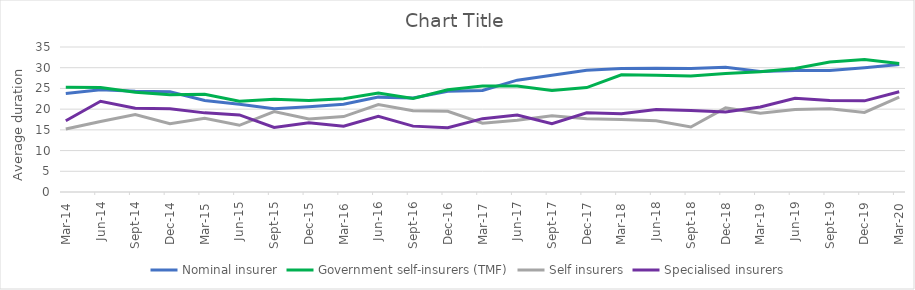
| Category | Nominal insurer | Government self-insurers (TMF) | Self insurers | Specialised insurers |
|---|---|---|---|---|
| 2014-03-31 | 23.8 | 25.3 | 15.2 | 17.2 |
| 2014-06-30 | 24.7 | 25.2 | 17 | 21.9 |
| 2014-09-30 | 24.3 | 24.1 | 18.7 | 20.2 |
| 2014-12-31 | 24.2 | 23.5 | 16.5 | 20.1 |
| 2015-03-31 | 22.1 | 23.6 | 17.8 | 19.1 |
| 2015-06-30 | 21.2 | 21.9 | 16.1 | 18.6 |
| 2015-09-30 | 20.1 | 22.4 | 19.4 | 15.6 |
| 2015-12-31 | 20.6 | 22.1 | 17.6 | 16.7 |
| 2016-03-31 | 21.2 | 22.5 | 18.2 | 15.9 |
| 2016-06-30 | 22.9 | 23.9 | 21.1 | 18.3 |
| 2016-09-30 | 22.7 | 22.6 | 19.6 | 15.9 |
| 2016-12-31 | 24.3 | 24.7 | 19.5 | 15.5 |
| 2017-03-31 | 24.5 | 25.6 | 16.6 | 17.7 |
| 2017-06-30 | 27 | 25.6 | 17.3 | 18.6 |
| 2017-09-30 | 28.2 | 24.5 | 18.4 | 16.5 |
| 2017-12-31 | 29.4 | 25.2 | 17.7 | 19.1 |
| 2018-03-31 | 29.8 | 28.3 | 17.5 | 18.9 |
| 2018-06-30 | 29.9 | 28.2 | 17.2 | 19.9 |
| 2018-09-30 | 29.8 | 28 | 15.7 | 19.7 |
| 2018-12-31 | 30.1 | 28.6 | 20.3 | 19.3 |
| 2019-03-31 | 29.1 | 29 | 19 | 20.5 |
| 2019-06-30 | 29.3 | 29.8 | 19.9 | 22.6 |
| 2019-09-30 | 29.3 | 31.4 | 20.1 | 22.1 |
| 2019-12-31 | 30 | 32 | 19.2 | 22 |
| 2020-03-31 | 30.8 | 31 | 22.9 | 24.2 |